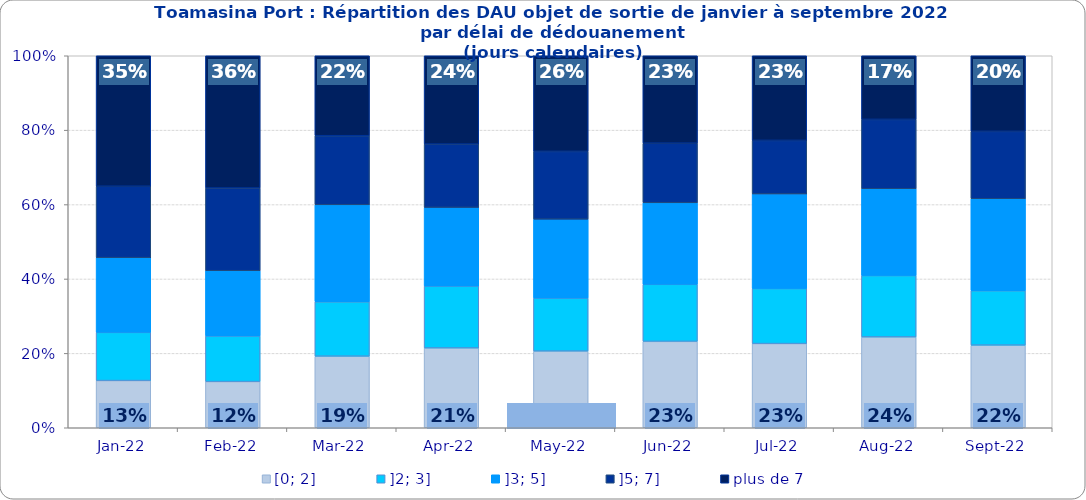
| Category | [0; 2] | ]2; 3] | ]3; 5] | ]5; 7] | plus de 7 |
|---|---|---|---|---|---|
| 2022-01-01 | 0.127 | 0.13 | 0.201 | 0.192 | 0.351 |
| 2022-02-01 | 0.124 | 0.123 | 0.175 | 0.222 | 0.356 |
| 2022-03-01 | 0.192 | 0.146 | 0.261 | 0.186 | 0.215 |
| 2022-04-01 | 0.214 | 0.166 | 0.211 | 0.17 | 0.237 |
| 2022-05-01 | 0.206 | 0.143 | 0.212 | 0.182 | 0.257 |
| 2022-06-01 | 0.232 | 0.153 | 0.219 | 0.16 | 0.235 |
| 2022-07-01 | 0.226 | 0.148 | 0.254 | 0.144 | 0.228 |
| 2022-08-01 | 0.244 | 0.165 | 0.233 | 0.186 | 0.171 |
| 2022-09-01 | 0.222 | 0.146 | 0.247 | 0.181 | 0.203 |